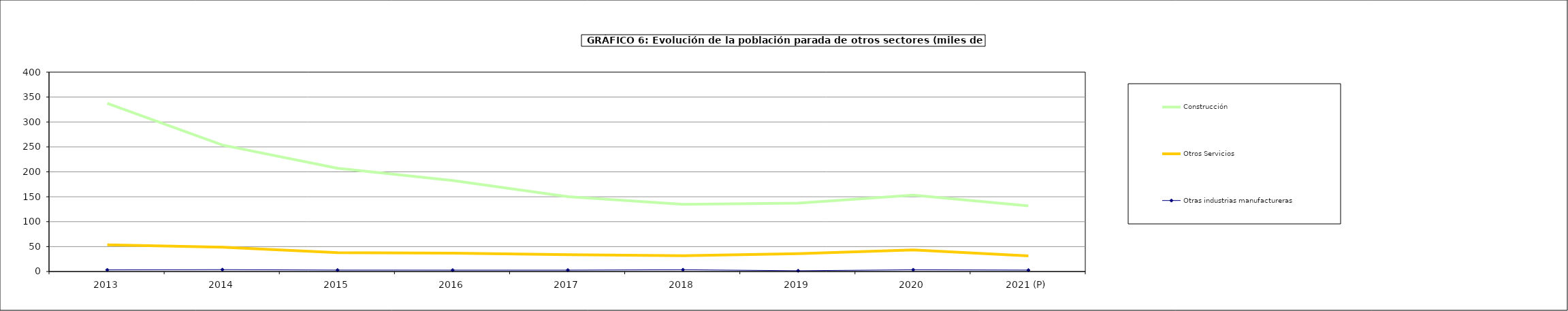
| Category | Construcción | Otros Servicios | Otras industrias manufactureras |
|---|---|---|---|
| 2013 | 337.3 | 53.6 | 3.3 |
| 2014 | 253.7 | 48.725 | 3.775 |
| 2015 | 207.3 | 38 | 2.9 |
| 2016 | 182.7 | 36.7 | 2.8 |
| 2017 | 150.3 | 33.7 | 2.8 |
| 2018 | 134.825 | 31.575 | 3.6 |
| 2019 | 137.35 | 35.9 | 1.55 |
| 2020 | 153.4 | 43.325 | 3.5 |
| 2021 (P) | 131.775 | 31.45 | 2.9 |